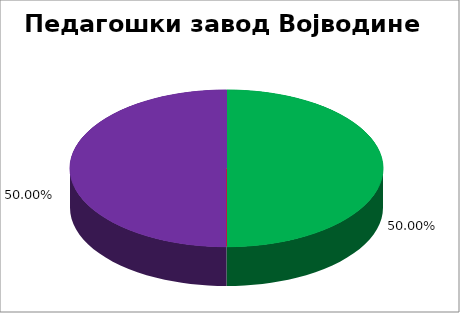
| Category | Педагошки завод Војводине |
|---|---|
| 0 | 0.5 |
| 1 | 0 |
| 2 | 0 |
| 3 | 0 |
| 4 | 0.5 |